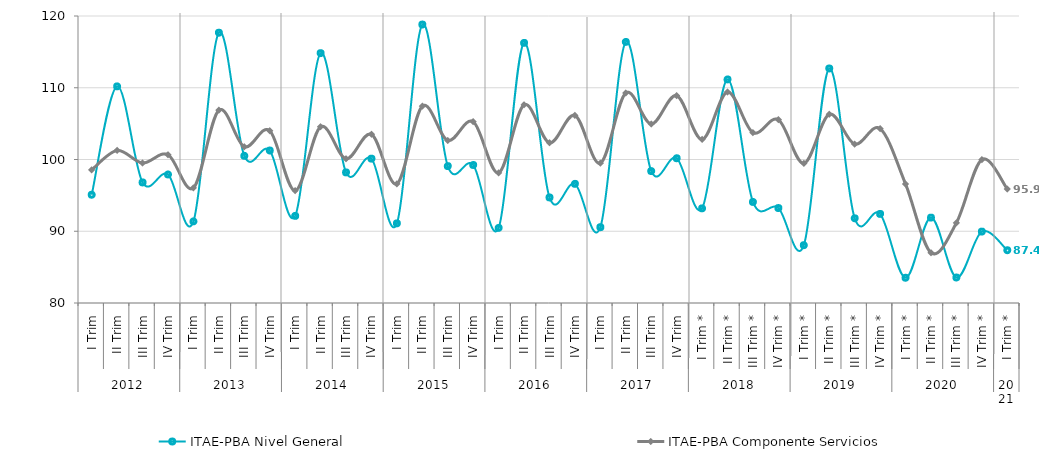
| Category | ITAE-PBA Nivel General | ITAE-PBA Componente Servicios |
|---|---|---|
| 0 | 95.089 | 98.555 |
| 1 | 110.192 | 101.26 |
| 2 | 96.803 | 99.511 |
| 3 | 97.916 | 100.674 |
| 4 | 91.378 | 96.041 |
| 5 | 117.669 | 106.872 |
| 6 | 100.518 | 101.77 |
| 7 | 101.252 | 104.014 |
| 8 | 92.143 | 95.658 |
| 9 | 114.82 | 104.564 |
| 10 | 98.199 | 100.099 |
| 11 | 100.119 | 103.508 |
| 12 | 91.095 | 96.613 |
| 13 | 118.811 | 107.439 |
| 14 | 99.079 | 102.66 |
| 15 | 99.236 | 105.274 |
| 16 | 90.468 | 98.142 |
| 17 | 116.254 | 107.622 |
| 18 | 94.71 | 102.328 |
| 19 | 96.608 | 106.142 |
| 20 | 90.565 | 99.485 |
| 21 | 116.386 | 109.276 |
| 22 | 98.389 | 104.959 |
| 23 | 100.175 | 108.895 |
| 24 | 93.191 | 102.805 |
| 25 | 111.161 | 109.397 |
| 26 | 94.084 | 103.743 |
| 27 | 93.234 | 105.543 |
| 28 | 88.057 | 99.457 |
| 29 | 112.685 | 106.297 |
| 30 | 91.807 | 102.139 |
| 31 | 92.416 | 104.303 |
| 32 | 83.519 | 96.583 |
| 33 | 91.898 | 87.003 |
| 34 | 83.554 | 91.175 |
| 35 | 89.95 | 99.995 |
| 36 | 87.355 | 95.887 |